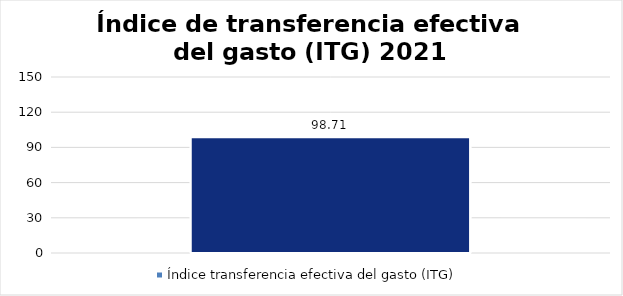
| Category | Índice transferencia efectiva del gasto (ITG) |
|---|---|
| Total programa | 98.707 |